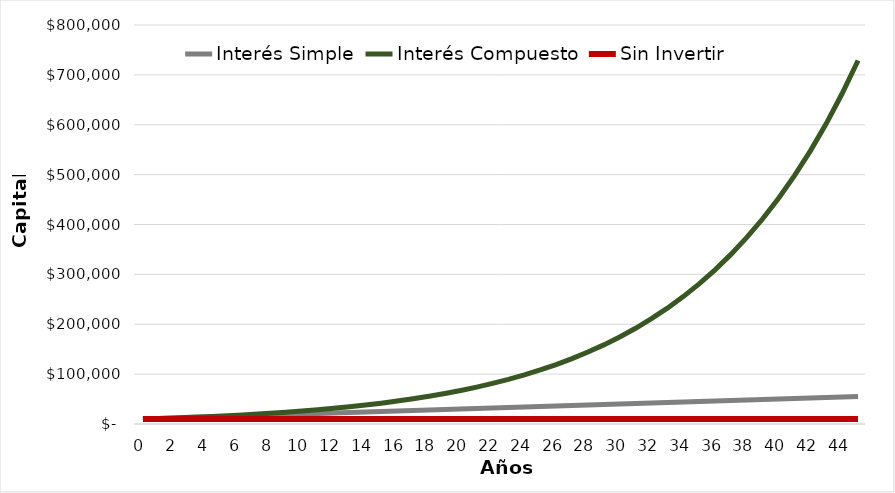
| Category | Interés Simple | Interés Compuesto | Sin Invertir |
|---|---|---|---|
| 0.0 | 10000 | 10000 | 10000 |
| 1.0 | 11000 | 11000 | 10000 |
| 2.0 | 12000 | 12100 | 10000 |
| 3.0 | 13000 | 13310 | 10000 |
| 4.0 | 14000 | 14641 | 10000 |
| 5.0 | 15000 | 16105.1 | 10000 |
| 6.0 | 16000 | 17715.61 | 10000 |
| 7.0 | 17000 | 19487.171 | 10000 |
| 8.0 | 18000 | 21435.888 | 10000 |
| 9.0 | 19000 | 23579.477 | 10000 |
| 10.0 | 20000 | 25937.425 | 10000 |
| 11.0 | 21000 | 28531.167 | 10000 |
| 12.0 | 22000 | 31384.284 | 10000 |
| 13.0 | 23000 | 34522.712 | 10000 |
| 14.0 | 24000 | 37974.983 | 10000 |
| 15.0 | 25000 | 41772.482 | 10000 |
| 16.0 | 26000 | 45949.73 | 10000 |
| 17.0 | 27000 | 50544.703 | 10000 |
| 18.0 | 28000 | 55599.173 | 10000 |
| 19.0 | 29000 | 61159.09 | 10000 |
| 20.0 | 30000 | 67274.999 | 10000 |
| 21.0 | 31000 | 74002.499 | 10000 |
| 22.0 | 32000 | 81402.749 | 10000 |
| 23.0 | 33000 | 89543.024 | 10000 |
| 24.0 | 34000 | 98497.327 | 10000 |
| 25.0 | 35000 | 108347.059 | 10000 |
| 26.0 | 36000 | 119181.765 | 10000 |
| 27.0 | 37000 | 131099.942 | 10000 |
| 28.0 | 38000 | 144209.936 | 10000 |
| 29.0 | 39000 | 158630.93 | 10000 |
| 30.0 | 40000 | 174494.023 | 10000 |
| 31.0 | 41000 | 191943.425 | 10000 |
| 32.0 | 42000 | 211137.767 | 10000 |
| 33.0 | 43000 | 232251.544 | 10000 |
| 34.0 | 44000 | 255476.699 | 10000 |
| 35.0 | 45000 | 281024.368 | 10000 |
| 36.0 | 46000 | 309126.805 | 10000 |
| 37.0 | 47000 | 340039.486 | 10000 |
| 38.0 | 48000 | 374043.434 | 10000 |
| 39.0 | 49000 | 411447.778 | 10000 |
| 40.0 | 50000 | 452592.556 | 10000 |
| 41.0 | 51000 | 497851.811 | 10000 |
| 42.0 | 52000 | 547636.992 | 10000 |
| 43.0 | 53000 | 602400.692 | 10000 |
| 44.0 | 54000 | 662640.761 | 10000 |
| 45.0 | 55000 | 728904.837 | 10000 |